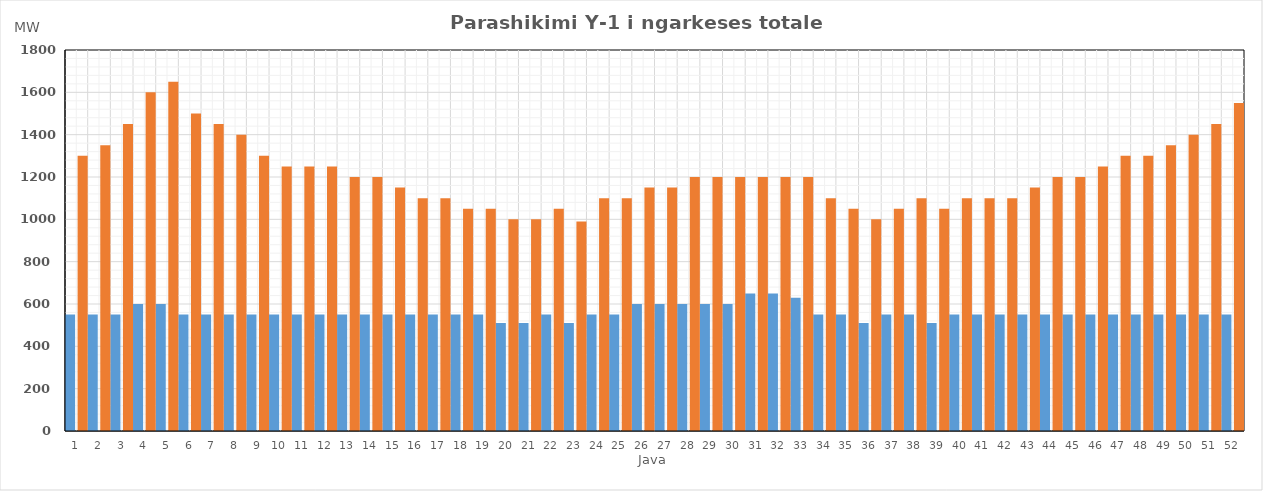
| Category | Min (MW) | Max (MW) |
|---|---|---|
| 0 | 550 | 1300 |
| 1 | 550 | 1350 |
| 2 | 550 | 1450 |
| 3 | 600 | 1600 |
| 4 | 600 | 1650 |
| 5 | 550 | 1500 |
| 6 | 550 | 1450 |
| 7 | 550 | 1400 |
| 8 | 550 | 1300 |
| 9 | 550 | 1250 |
| 10 | 550 | 1250 |
| 11 | 550 | 1250 |
| 12 | 550 | 1200 |
| 13 | 550 | 1200 |
| 14 | 550 | 1150 |
| 15 | 550 | 1100 |
| 16 | 550 | 1100 |
| 17 | 550 | 1050 |
| 18 | 550 | 1050 |
| 19 | 510 | 1000 |
| 20 | 510 | 1000 |
| 21 | 550 | 1050 |
| 22 | 510 | 990 |
| 23 | 550 | 1100 |
| 24 | 550 | 1100 |
| 25 | 600 | 1150 |
| 26 | 600 | 1150 |
| 27 | 600 | 1200 |
| 28 | 600 | 1200 |
| 29 | 600 | 1200 |
| 30 | 650 | 1200 |
| 31 | 650 | 1200 |
| 32 | 630 | 1200 |
| 33 | 550 | 1100 |
| 34 | 550 | 1050 |
| 35 | 510 | 1000 |
| 36 | 550 | 1050 |
| 37 | 550 | 1100 |
| 38 | 510 | 1050 |
| 39 | 550 | 1100 |
| 40 | 550 | 1100 |
| 41 | 550 | 1100 |
| 42 | 550 | 1150 |
| 43 | 550 | 1200 |
| 44 | 550 | 1200 |
| 45 | 550 | 1250 |
| 46 | 550 | 1300 |
| 47 | 550 | 1300 |
| 48 | 550 | 1350 |
| 49 | 550 | 1400 |
| 50 | 550 | 1450 |
| 51 | 550 | 1550 |